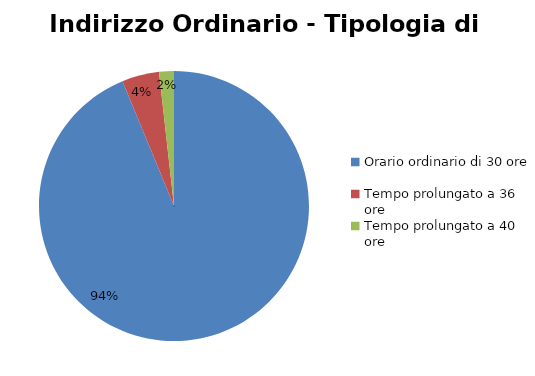
| Category | Series 0 |
|---|---|
| Orario ordinario di 30 ore | 33721 |
| Tempo prolungato a 36 ore | 1604 |
| Tempo prolungato a 40 ore | 637 |